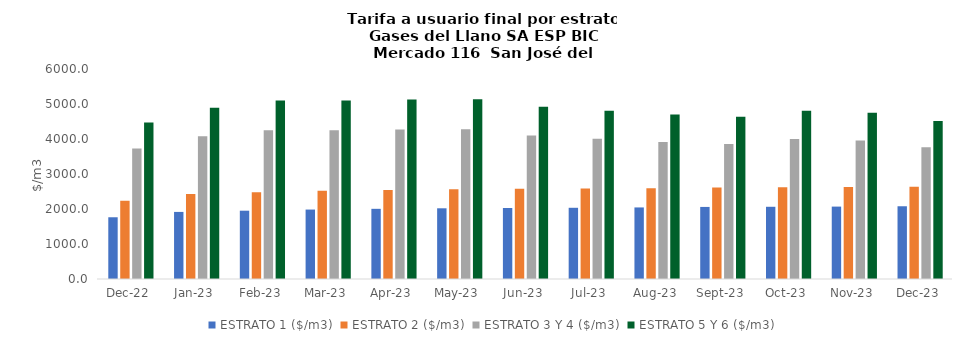
| Category | ESTRATO 1 ($/m3) | ESTRATO 2 ($/m3) | ESTRATO 3 Y 4 ($/m3) | ESTRATO 5 Y 6 ($/m3) |
|---|---|---|---|---|
| 2022-12-01 | 1763.93 | 2235.71 | 3725.2 | 4470.24 |
| 2023-01-01 | 1916.75 | 2431.28 | 4077.6 | 4893.12 |
| 2023-02-01 | 1951.54 | 2475.41 | 4250.37 | 5100.444 |
| 2023-03-01 | 1984.02 | 2519.25 | 4250.37 | 5100.444 |
| 2023-04-01 | 2005.09 | 2546.01 | 4273.76 | 5128.512 |
| 2023-05-01 | 2020.1 | 2565.07 | 4279.7 | 5135.64 |
| 2023-06-01 | 2028.44 | 2575.66 | 4098.64 | 4918.368 |
| 2023-07-01 | 2034.66 | 2583.55 | 4008.82 | 4810.584 |
| 2023-08-01 | 2044.67 | 2596.26 | 3914.14 | 4696.968 |
| 2023-09-01 | 2059.07 | 2614.55 | 3860.26 | 4632.312 |
| 2023-10-01 | 2063.47 | 2620.13 | 4003.57 | 4804.284 |
| 2023-11-01 | 2068.62 | 2626.68 | 3959.2 | 4751.04 |
| 2023-12-01 | 2078.32 | 2639 | 3760.95 | 4513.14 |